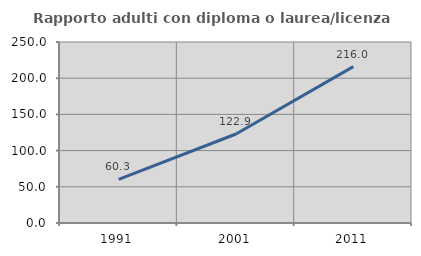
| Category | Rapporto adulti con diploma o laurea/licenza media  |
|---|---|
| 1991.0 | 60.268 |
| 2001.0 | 122.921 |
| 2011.0 | 216.009 |